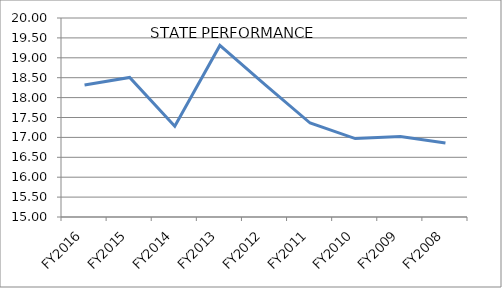
| Category | Series 0 |
|---|---|
| FY2016 | 18.315 |
| FY2015 | 18.506 |
| FY2014 | 17.28 |
| FY2013 | 19.31 |
| FY2012 | 18.329 |
| FY2011 | 17.361 |
| FY2010 | 16.97 |
| FY2009 | 17.02 |
| FY2008 | 16.86 |